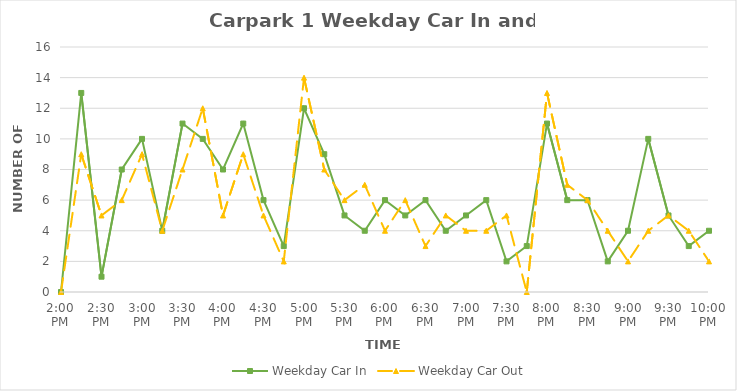
| Category | Weekday Car In | Weekday Car Out |
|---|---|---|
| 0.5833333333333334 | 0 | 0 |
| 0.59375 | 13 | 9 |
| 0.604166666666667 | 1 | 5 |
| 0.614583333333334 | 8 | 6 |
| 0.625 | 10 | 9 |
| 0.635416666666667 | 4 | 4 |
| 0.645833333333334 | 11 | 8 |
| 0.656250000000001 | 10 | 12 |
| 0.666666666666667 | 8 | 5 |
| 0.677083333333334 | 11 | 9 |
| 0.687500000000001 | 6 | 5 |
| 0.697916666666668 | 3 | 2 |
| 0.708333333333335 | 12 | 14 |
| 0.718750000000002 | 9 | 8 |
| 0.729166666666669 | 5 | 6 |
| 0.739583333333336 | 4 | 7 |
| 0.75 | 6 | 4 |
| 0.7604166666666666 | 5 | 6 |
| 0.7708333333333334 | 6 | 3 |
| 0.78125 | 4 | 5 |
| 0.7916666666666666 | 5 | 4 |
| 0.8020833333333334 | 6 | 4 |
| 0.8125 | 2 | 5 |
| 0.8229166666666666 | 3 | 0 |
| 0.8333333333333334 | 11 | 13 |
| 0.84375 | 6 | 7 |
| 0.8541666666666666 | 6 | 6 |
| 0.8645833333333334 | 2 | 4 |
| 0.875 | 4 | 2 |
| 0.8854166666666666 | 10 | 4 |
| 0.8958333333333334 | 5 | 5 |
| 0.90625 | 3 | 4 |
| 0.9166666666666666 | 4 | 2 |